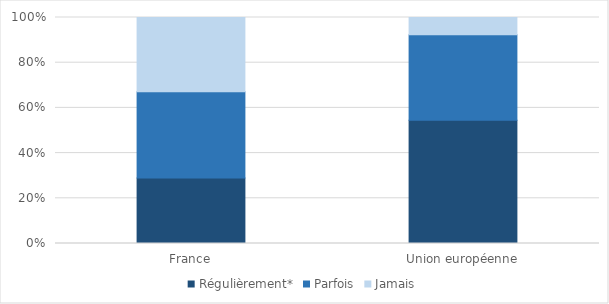
| Category | Régulièrement* | Parfois | Jamais |
|---|---|---|---|
| France | 29 | 38.2 | 32.8 |
| Union européenne | 54.5 | 37.9 | 7.6 |